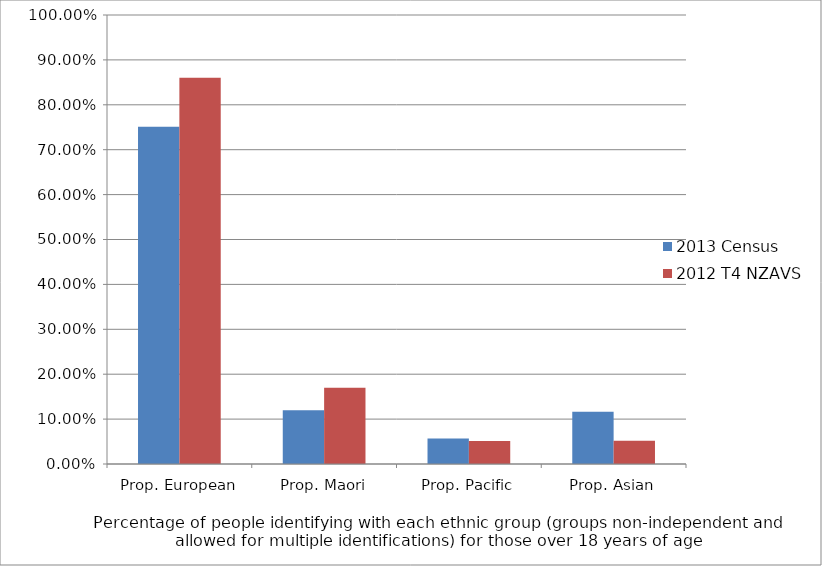
| Category | 2013 Census | 2012 T4 NZAVS |
|---|---|---|
| Prop. European | 0.751 | 0.86 |
| Prop. Maori | 0.119 | 0.17 |
| Prop. Pacific | 0.057 | 0.051 |
| Prop. Asian | 0.117 | 0.052 |